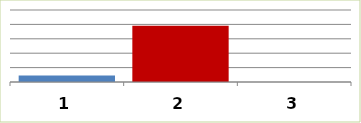
| Category | Series 0 |
|---|---|
| 0 | 452000 |
| 1 | 3900000 |
| 2 | 0 |